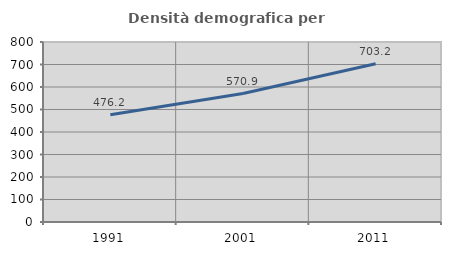
| Category | Densità demografica |
|---|---|
| 1991.0 | 476.21 |
| 2001.0 | 570.866 |
| 2011.0 | 703.194 |